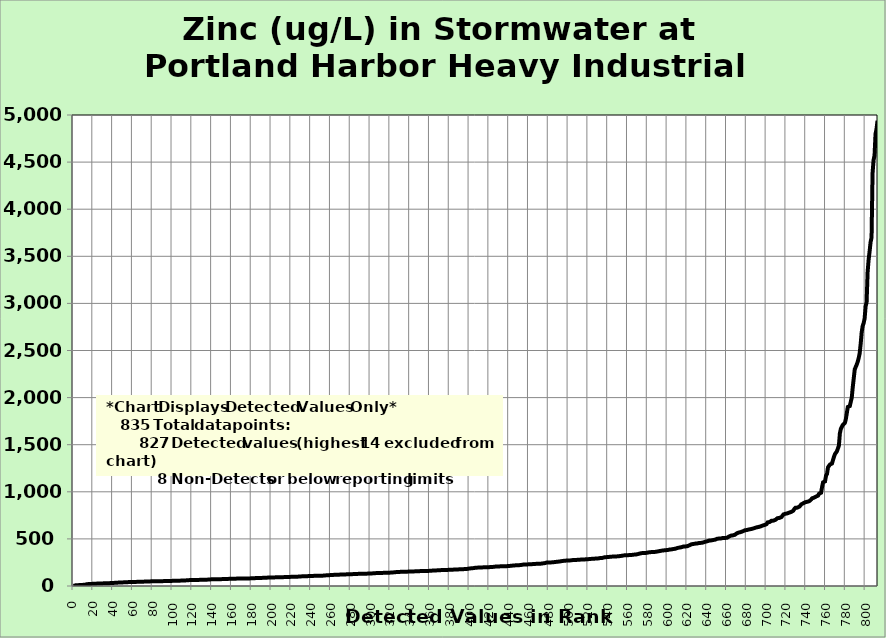
| Category | Zinc |
|---|---|
| 0.0 | 1.43 |
| 1.0 | 2.48 |
| 2.0 | 6.9 |
| 3.0 | 8 |
| 4.0 | 8.02 |
| 5.0 | 9.64 |
| 6.0 | 10 |
| 7.0 | 10.4 |
| 8.0 | 10.7 |
| 9.0 | 11.9 |
| 10.0 | 12.5 |
| 11.0 | 14.5 |
| 12.0 | 15 |
| 13.0 | 16.4 |
| 14.0 | 19.8 |
| 15.0 | 20 |
| 16.0 | 20.2 |
| 17.0 | 21.3 |
| 18.0 | 22.1 |
| 19.0 | 22.1 |
| 20.0 | 23.2 |
| 21.0 | 23.9 |
| 22.0 | 24 |
| 23.0 | 24.9 |
| 24.0 | 25.8 |
| 25.0 | 26 |
| 26.0 | 26.6 |
| 27.0 | 27 |
| 28.0 | 27 |
| 29.0 | 27.8 |
| 30.0 | 27.9 |
| 31.0 | 28 |
| 32.0 | 28.5 |
| 33.0 | 28.6 |
| 34.0 | 29 |
| 35.0 | 29.6 |
| 36.0 | 30.3 |
| 37.0 | 30.7 |
| 38.0 | 31 |
| 39.0 | 32 |
| 40.0 | 32.6 |
| 41.0 | 32.7 |
| 42.0 | 33.6 |
| 43.0 | 34 |
| 44.0 | 35 |
| 45.0 | 36 |
| 46.0 | 36.7 |
| 47.0 | 36.8 |
| 48.0 | 37.6 |
| 49.0 | 38.4 |
| 50.0 | 38.4 |
| 51.0 | 38.4 |
| 52.0 | 38.9 |
| 53.0 | 39.1 |
| 54.0 | 40.5 |
| 55.0 | 41 |
| 56.0 | 41.6 |
| 57.0 | 41.8 |
| 58.0 | 41.8 |
| 59.0 | 41.9 |
| 60.0 | 42.3 |
| 61.0 | 42.3 |
| 62.0 | 43 |
| 63.0 | 43.6 |
| 64.0 | 44 |
| 65.0 | 44.3 |
| 66.0 | 44.5 |
| 67.0 | 44.6 |
| 68.0 | 44.9 |
| 69.0 | 45 |
| 70.0 | 45.3 |
| 71.0 | 47.1 |
| 72.0 | 47.2 |
| 73.0 | 47.2 |
| 74.0 | 48 |
| 75.0 | 48 |
| 76.0 | 48.3 |
| 77.0 | 48.8 |
| 78.0 | 49.2 |
| 79.0 | 49.4 |
| 80.0 | 49.7 |
| 81.0 | 50 |
| 82.0 | 50 |
| 83.0 | 50.3 |
| 84.0 | 51 |
| 85.0 | 51 |
| 86.0 | 51.1 |
| 87.0 | 51.1 |
| 88.0 | 51.2 |
| 89.0 | 51.4 |
| 90.0 | 51.6 |
| 91.0 | 51.9 |
| 92.0 | 52 |
| 93.0 | 52 |
| 94.0 | 52 |
| 95.0 | 52.1 |
| 96.0 | 53.5 |
| 97.0 | 53.7 |
| 98.0 | 53.9 |
| 99.0 | 54 |
| 100.0 | 54.5 |
| 101.0 | 55 |
| 102.0 | 55.3 |
| 103.0 | 55.4 |
| 104.0 | 56.7 |
| 105.0 | 57 |
| 106.0 | 57 |
| 107.0 | 57 |
| 108.0 | 57 |
| 109.0 | 57.5 |
| 110.0 | 58 |
| 111.0 | 58.4 |
| 112.0 | 58.6 |
| 113.0 | 59.9 |
| 114.0 | 60 |
| 115.0 | 61 |
| 116.0 | 62 |
| 117.0 | 62.1 |
| 118.0 | 62.8 |
| 119.0 | 63.2 |
| 120.0 | 63.5 |
| 121.0 | 63.8 |
| 122.0 | 64 |
| 123.0 | 64 |
| 124.0 | 64.2 |
| 125.0 | 64.5 |
| 126.0 | 64.7 |
| 127.0 | 65 |
| 128.0 | 65.3 |
| 129.0 | 65.9 |
| 130.0 | 66 |
| 131.0 | 66 |
| 132.0 | 66.1 |
| 133.0 | 66.8 |
| 134.0 | 67 |
| 135.0 | 67.3 |
| 136.0 | 68 |
| 137.0 | 69 |
| 138.0 | 69.9 |
| 139.0 | 70 |
| 140.0 | 71.1 |
| 141.0 | 71.7 |
| 142.0 | 71.9 |
| 143.0 | 72 |
| 144.0 | 72 |
| 145.0 | 72 |
| 146.0 | 72.3 |
| 147.0 | 72.5 |
| 148.0 | 72.6 |
| 149.0 | 73 |
| 150.0 | 73 |
| 151.0 | 73.3 |
| 152.0 | 73.5 |
| 153.0 | 74.6 |
| 154.0 | 75 |
| 155.0 | 75 |
| 156.0 | 75.2 |
| 157.0 | 75.7 |
| 158.0 | 76.6 |
| 159.0 | 76.6 |
| 160.0 | 76.8 |
| 161.0 | 77.1 |
| 162.0 | 77.8 |
| 163.0 | 78 |
| 164.0 | 78 |
| 165.0 | 78.6 |
| 166.0 | 79 |
| 167.0 | 79.4 |
| 168.0 | 79.5 |
| 169.0 | 79.6 |
| 170.0 | 79.6 |
| 171.0 | 79.7 |
| 172.0 | 79.9 |
| 173.0 | 80 |
| 174.0 | 80.3 |
| 175.0 | 80.6 |
| 176.0 | 80.6 |
| 177.0 | 80.6 |
| 178.0 | 80.8 |
| 179.0 | 81 |
| 180.0 | 81.2 |
| 181.0 | 81.2 |
| 182.0 | 81.3 |
| 183.0 | 83.9 |
| 184.0 | 84.2 |
| 185.0 | 84.3 |
| 186.0 | 84.4 |
| 187.0 | 84.8 |
| 188.0 | 85 |
| 189.0 | 86 |
| 190.0 | 86 |
| 191.0 | 86.6 |
| 192.0 | 86.8 |
| 193.0 | 86.9 |
| 194.0 | 87 |
| 195.0 | 88.5 |
| 196.0 | 89 |
| 197.0 | 89.2 |
| 198.0 | 89.8 |
| 199.0 | 90 |
| 200.0 | 90.4 |
| 201.0 | 90.5 |
| 202.0 | 91.1 |
| 203.0 | 91.6 |
| 204.0 | 91.7 |
| 205.0 | 92 |
| 206.0 | 92.4 |
| 207.0 | 92.4 |
| 208.0 | 92.8 |
| 209.0 | 93 |
| 210.0 | 93.6 |
| 211.0 | 94 |
| 212.0 | 94 |
| 213.0 | 94.7 |
| 214.0 | 95 |
| 215.0 | 95.2 |
| 216.0 | 96 |
| 217.0 | 96.3 |
| 218.0 | 96.6 |
| 219.0 | 96.8 |
| 220.0 | 97 |
| 221.0 | 97 |
| 222.0 | 97.1 |
| 223.0 | 97.7 |
| 224.0 | 98 |
| 225.0 | 98 |
| 226.0 | 98.6 |
| 227.0 | 99 |
| 228.0 | 101 |
| 229.0 | 102 |
| 230.0 | 102 |
| 231.0 | 103 |
| 232.0 | 103 |
| 233.0 | 103 |
| 234.0 | 104 |
| 235.0 | 104 |
| 236.0 | 104 |
| 237.0 | 105 |
| 238.0 | 106 |
| 239.0 | 106 |
| 240.0 | 107 |
| 241.0 | 107 |
| 242.0 | 107 |
| 243.0 | 108 |
| 244.0 | 109 |
| 245.0 | 109 |
| 246.0 | 110 |
| 247.0 | 110 |
| 248.0 | 110 |
| 249.0 | 110 |
| 250.0 | 110 |
| 251.0 | 110 |
| 252.0 | 110 |
| 253.0 | 111 |
| 254.0 | 112 |
| 255.0 | 113 |
| 256.0 | 114 |
| 257.0 | 114 |
| 258.0 | 115 |
| 259.0 | 115 |
| 260.0 | 116 |
| 261.0 | 116 |
| 262.0 | 117 |
| 263.0 | 119 |
| 264.0 | 120 |
| 265.0 | 120 |
| 266.0 | 120 |
| 267.0 | 120 |
| 268.0 | 120 |
| 269.0 | 121 |
| 270.0 | 122 |
| 271.0 | 122 |
| 272.0 | 122 |
| 273.0 | 122 |
| 274.0 | 122 |
| 275.0 | 124 |
| 276.0 | 124 |
| 277.0 | 124 |
| 278.0 | 124 |
| 279.0 | 124 |
| 280.0 | 125 |
| 281.0 | 125 |
| 282.0 | 126 |
| 283.0 | 127 |
| 284.0 | 127 |
| 285.0 | 128 |
| 286.0 | 128 |
| 287.0 | 128 |
| 288.0 | 129 |
| 289.0 | 129 |
| 290.0 | 129 |
| 291.0 | 129 |
| 292.0 | 130 |
| 293.0 | 130 |
| 294.0 | 130 |
| 295.0 | 130 |
| 296.0 | 131 |
| 297.0 | 131 |
| 298.0 | 132 |
| 299.0 | 133 |
| 300.0 | 133 |
| 301.0 | 134 |
| 302.0 | 134 |
| 303.0 | 134 |
| 304.0 | 136 |
| 305.0 | 137 |
| 306.0 | 137 |
| 307.0 | 137 |
| 308.0 | 138 |
| 309.0 | 139 |
| 310.0 | 139 |
| 311.0 | 139 |
| 312.0 | 139 |
| 313.0 | 139 |
| 314.0 | 140 |
| 315.0 | 140 |
| 316.0 | 140 |
| 317.0 | 140 |
| 318.0 | 141 |
| 319.0 | 142 |
| 320.0 | 142 |
| 321.0 | 143 |
| 322.0 | 144 |
| 323.0 | 144 |
| 324.0 | 145 |
| 325.0 | 147 |
| 326.0 | 148 |
| 327.0 | 148 |
| 328.0 | 149 |
| 329.0 | 149 |
| 330.0 | 150 |
| 331.0 | 150 |
| 332.0 | 150 |
| 333.0 | 150 |
| 334.0 | 150 |
| 335.0 | 150 |
| 336.0 | 151 |
| 337.0 | 152 |
| 338.0 | 153 |
| 339.0 | 153 |
| 340.0 | 154 |
| 341.0 | 154 |
| 342.0 | 154 |
| 343.0 | 155 |
| 344.0 | 155 |
| 345.0 | 156 |
| 346.0 | 156 |
| 347.0 | 156 |
| 348.0 | 157 |
| 349.0 | 158 |
| 350.0 | 158 |
| 351.0 | 158 |
| 352.0 | 158 |
| 353.0 | 159 |
| 354.0 | 160 |
| 355.0 | 160 |
| 356.0 | 160 |
| 357.0 | 160 |
| 358.0 | 160 |
| 359.0 | 160 |
| 360.0 | 161 |
| 361.0 | 162 |
| 362.0 | 163 |
| 363.0 | 164 |
| 364.0 | 165 |
| 365.0 | 165 |
| 366.0 | 165 |
| 367.0 | 167 |
| 368.0 | 167 |
| 369.0 | 168 |
| 370.0 | 168 |
| 371.0 | 168 |
| 372.0 | 169 |
| 373.0 | 169 |
| 374.0 | 169 |
| 375.0 | 170 |
| 376.0 | 170 |
| 377.0 | 170 |
| 378.0 | 171 |
| 379.0 | 171 |
| 380.0 | 172 |
| 381.0 | 172 |
| 382.0 | 173 |
| 383.0 | 173 |
| 384.0 | 174 |
| 385.0 | 174 |
| 386.0 | 174 |
| 387.0 | 176 |
| 388.0 | 176 |
| 389.0 | 177 |
| 390.0 | 177 |
| 391.0 | 177 |
| 392.0 | 177 |
| 393.0 | 179 |
| 394.0 | 179 |
| 395.0 | 180 |
| 396.0 | 180 |
| 397.0 | 180 |
| 398.0 | 182 |
| 399.0 | 184 |
| 400.0 | 186 |
| 401.0 | 187 |
| 402.0 | 188 |
| 403.0 | 189 |
| 404.0 | 190 |
| 405.0 | 190 |
| 406.0 | 194 |
| 407.0 | 195 |
| 408.0 | 195 |
| 409.0 | 196 |
| 410.0 | 196 |
| 411.0 | 196 |
| 412.0 | 197 |
| 413.0 | 198 |
| 414.0 | 198 |
| 415.0 | 199 |
| 416.0 | 199 |
| 417.0 | 200 |
| 418.0 | 200 |
| 419.0 | 200 |
| 420.0 | 200 |
| 421.0 | 201 |
| 422.0 | 202 |
| 423.0 | 202 |
| 424.0 | 203 |
| 425.0 | 204 |
| 426.0 | 206 |
| 427.0 | 206 |
| 428.0 | 206 |
| 429.0 | 207 |
| 430.0 | 208 |
| 431.0 | 209 |
| 432.0 | 209 |
| 433.0 | 210 |
| 434.0 | 210 |
| 435.0 | 210 |
| 436.0 | 210 |
| 437.0 | 210 |
| 438.0 | 211 |
| 439.0 | 211 |
| 440.0 | 212 |
| 441.0 | 215 |
| 442.0 | 215 |
| 443.0 | 217 |
| 444.0 | 217 |
| 445.0 | 218 |
| 446.0 | 219 |
| 447.0 | 219 |
| 448.0 | 220 |
| 449.0 | 220 |
| 450.0 | 221 |
| 451.0 | 222 |
| 452.0 | 223 |
| 453.0 | 225 |
| 454.0 | 227 |
| 455.0 | 227 |
| 456.0 | 228 |
| 457.0 | 229 |
| 458.0 | 229 |
| 459.0 | 230 |
| 460.0 | 230 |
| 461.0 | 230 |
| 462.0 | 230 |
| 463.0 | 232 |
| 464.0 | 233 |
| 465.0 | 233 |
| 466.0 | 234 |
| 467.0 | 236 |
| 468.0 | 236 |
| 469.0 | 237 |
| 470.0 | 237 |
| 471.0 | 237 |
| 472.0 | 237 |
| 473.0 | 239 |
| 474.0 | 240 |
| 475.0 | 241 |
| 476.0 | 243 |
| 477.0 | 247 |
| 478.0 | 249 |
| 479.0 | 249 |
| 480.0 | 249 |
| 481.0 | 249 |
| 482.0 | 250 |
| 483.0 | 251 |
| 484.0 | 252 |
| 485.0 | 253 |
| 486.0 | 254 |
| 487.0 | 255 |
| 488.0 | 257 |
| 489.0 | 257 |
| 490.0 | 259 |
| 491.0 | 260 |
| 492.0 | 262 |
| 493.0 | 264 |
| 494.0 | 266 |
| 495.0 | 267 |
| 496.0 | 268 |
| 497.0 | 270 |
| 498.0 | 270 |
| 499.0 | 271 |
| 500.0 | 271 |
| 501.0 | 272 |
| 502.0 | 272 |
| 503.0 | 275 |
| 504.0 | 275 |
| 505.0 | 276 |
| 506.0 | 277 |
| 507.0 | 277 |
| 508.0 | 277 |
| 509.0 | 278 |
| 510.0 | 279 |
| 511.0 | 279 |
| 512.0 | 280 |
| 513.0 | 281 |
| 514.0 | 281 |
| 515.0 | 281 |
| 516.0 | 281 |
| 517.0 | 285 |
| 518.0 | 285 |
| 519.0 | 285 |
| 520.0 | 285 |
| 521.0 | 286 |
| 522.0 | 287 |
| 523.0 | 287 |
| 524.0 | 289 |
| 525.0 | 290 |
| 526.0 | 290 |
| 527.0 | 290 |
| 528.0 | 292 |
| 529.0 | 292 |
| 530.0 | 293 |
| 531.0 | 296 |
| 532.0 | 297 |
| 533.0 | 297 |
| 534.0 | 298 |
| 535.0 | 299 |
| 536.0 | 304 |
| 537.0 | 306 |
| 538.0 | 306 |
| 539.0 | 307 |
| 540.0 | 308 |
| 541.0 | 310 |
| 542.0 | 310 |
| 543.0 | 311 |
| 544.0 | 312 |
| 545.0 | 312 |
| 546.0 | 312 |
| 547.0 | 312 |
| 548.0 | 314 |
| 549.0 | 315 |
| 550.0 | 315 |
| 551.0 | 316 |
| 552.0 | 318 |
| 553.0 | 319 |
| 554.0 | 321 |
| 555.0 | 321 |
| 556.0 | 325 |
| 557.0 | 326 |
| 558.0 | 326 |
| 559.0 | 327 |
| 560.0 | 327 |
| 561.0 | 329 |
| 562.0 | 329 |
| 563.0 | 329 |
| 564.0 | 330 |
| 565.0 | 330 |
| 566.0 | 333 |
| 567.0 | 333 |
| 568.0 | 334 |
| 569.0 | 335 |
| 570.0 | 339 |
| 571.0 | 340 |
| 572.0 | 345 |
| 573.0 | 346 |
| 574.0 | 349 |
| 575.0 | 350 |
| 576.0 | 350 |
| 577.0 | 350 |
| 578.0 | 351 |
| 579.0 | 353 |
| 580.0 | 355 |
| 581.0 | 356 |
| 582.0 | 359 |
| 583.0 | 360 |
| 584.0 | 360 |
| 585.0 | 360 |
| 586.0 | 360 |
| 587.0 | 361 |
| 588.0 | 363 |
| 589.0 | 363 |
| 590.0 | 367 |
| 591.0 | 370 |
| 592.0 | 371 |
| 593.0 | 375 |
| 594.0 | 375 |
| 595.0 | 377 |
| 596.0 | 378 |
| 597.0 | 378 |
| 598.0 | 380 |
| 599.0 | 381 |
| 600.0 | 382 |
| 601.0 | 382 |
| 602.0 | 387 |
| 603.0 | 387 |
| 604.0 | 389 |
| 605.0 | 392 |
| 606.0 | 393 |
| 607.0 | 395 |
| 608.0 | 396 |
| 609.0 | 397 |
| 610.0 | 404 |
| 611.0 | 406 |
| 612.0 | 408 |
| 613.0 | 408 |
| 614.0 | 412 |
| 615.0 | 414 |
| 616.0 | 419 |
| 617.0 | 420 |
| 618.0 | 420 |
| 619.0 | 422 |
| 620.0 | 423 |
| 621.0 | 426 |
| 622.0 | 432 |
| 623.0 | 437 |
| 624.0 | 443 |
| 625.0 | 446 |
| 626.0 | 446 |
| 627.0 | 448 |
| 628.0 | 450 |
| 629.0 | 450 |
| 630.0 | 452 |
| 631.0 | 453 |
| 632.0 | 457 |
| 633.0 | 457 |
| 634.0 | 458 |
| 635.0 | 461 |
| 636.0 | 462 |
| 637.0 | 464 |
| 638.0 | 470 |
| 639.0 | 474 |
| 640.0 | 475 |
| 641.0 | 480 |
| 642.0 | 482 |
| 643.0 | 483 |
| 644.0 | 484 |
| 645.0 | 487 |
| 646.0 | 488 |
| 647.0 | 492 |
| 648.0 | 492 |
| 649.0 | 498 |
| 650.0 | 501 |
| 651.0 | 502 |
| 652.0 | 504 |
| 653.0 | 504 |
| 654.0 | 505 |
| 655.0 | 505 |
| 656.0 | 510 |
| 657.0 | 510 |
| 658.0 | 510 |
| 659.0 | 510 |
| 660.0 | 512 |
| 661.0 | 522 |
| 662.0 | 525 |
| 663.0 | 527 |
| 664.0 | 535 |
| 665.0 | 538 |
| 666.0 | 538 |
| 667.0 | 544 |
| 668.0 | 544 |
| 669.0 | 554 |
| 670.0 | 560 |
| 671.0 | 567 |
| 672.0 | 568 |
| 673.0 | 569 |
| 674.0 | 573 |
| 675.0 | 578 |
| 676.0 | 581 |
| 677.0 | 590 |
| 678.0 | 591 |
| 679.0 | 594 |
| 680.0 | 594 |
| 681.0 | 598 |
| 682.0 | 600 |
| 683.0 | 600 |
| 684.0 | 604 |
| 685.0 | 604 |
| 686.0 | 609 |
| 687.0 | 610 |
| 688.0 | 616 |
| 689.0 | 616 |
| 690.0 | 623 |
| 691.0 | 624 |
| 692.0 | 627 |
| 693.0 | 630 |
| 694.0 | 633 |
| 695.0 | 635 |
| 696.0 | 642 |
| 697.0 | 645 |
| 698.0 | 648 |
| 699.0 | 651 |
| 700.0 | 657 |
| 701.0 | 675 |
| 702.0 | 676 |
| 703.0 | 679 |
| 704.0 | 682 |
| 705.0 | 693 |
| 706.0 | 694 |
| 707.0 | 694 |
| 708.0 | 702 |
| 709.0 | 703 |
| 710.0 | 704 |
| 711.0 | 720 |
| 712.0 | 720 |
| 713.0 | 723 |
| 714.0 | 727 |
| 715.0 | 732 |
| 716.0 | 737 |
| 717.0 | 760 |
| 718.0 | 763 |
| 719.0 | 767 |
| 720.0 | 770 |
| 721.0 | 771 |
| 722.0 | 776 |
| 723.0 | 780 |
| 724.0 | 785 |
| 725.0 | 787 |
| 726.0 | 797 |
| 727.0 | 800 |
| 728.0 | 818 |
| 729.0 | 830 |
| 730.0 | 830 |
| 731.0 | 832 |
| 732.0 | 837 |
| 733.0 | 842 |
| 734.0 | 853 |
| 735.0 | 867 |
| 736.0 | 869 |
| 737.0 | 878 |
| 738.0 | 882 |
| 739.0 | 889 |
| 740.0 | 894 |
| 741.0 | 894 |
| 742.0 | 899 |
| 743.0 | 900 |
| 744.0 | 907 |
| 745.0 | 918 |
| 746.0 | 931 |
| 747.0 | 937 |
| 748.0 | 938 |
| 749.0 | 943 |
| 750.0 | 950 |
| 751.0 | 952 |
| 752.0 | 960 |
| 753.0 | 980 |
| 754.0 | 983 |
| 755.0 | 990 |
| 756.0 | 1050 |
| 757.0 | 1100 |
| 758.0 | 1100 |
| 759.0 | 1110 |
| 760.0 | 1170 |
| 761.0 | 1190 |
| 762.0 | 1260 |
| 763.0 | 1270 |
| 764.0 | 1290 |
| 765.0 | 1300 |
| 766.0 | 1300 |
| 767.0 | 1310 |
| 768.0 | 1370 |
| 769.0 | 1400 |
| 770.0 | 1400 |
| 771.0 | 1430 |
| 772.0 | 1440 |
| 773.0 | 1490 |
| 774.0 | 1620 |
| 775.0 | 1670 |
| 776.0 | 1670 |
| 777.0 | 1710 |
| 778.0 | 1710 |
| 779.0 | 1730 |
| 780.0 | 1770 |
| 781.0 | 1780 |
| 782.0 | 1900 |
| 783.0 | 1900 |
| 784.0 | 1910 |
| 785.0 | 1910 |
| 786.0 | 2000 |
| 787.0 | 2110 |
| 788.0 | 2120 |
| 789.0 | 2300 |
| 790.0 | 2310 |
| 791.0 | 2350 |
| 792.0 | 2380 |
| 793.0 | 2420 |
| 794.0 | 2470 |
| 795.0 | 2570 |
| 796.0 | 2690 |
| 797.0 | 2760 |
| 798.0 | 2790 |
| 799.0 | 2840 |
| 800.0 | 2970 |
| 801.0 | 3010 |
| 802.0 | 3330 |
| 803.0 | 3460 |
| 804.0 | 3550 |
| 805.0 | 3650 |
| 806.0 | 3700 |
| 807.0 | 4380 |
| 808.0 | 4520 |
| 809.0 | 4570 |
| 810.0 | 4800 |
| 811.0 | 4850 |
| 812.0 | 4940 |